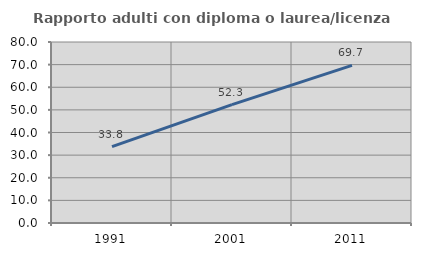
| Category | Rapporto adulti con diploma o laurea/licenza media  |
|---|---|
| 1991.0 | 33.784 |
| 2001.0 | 52.313 |
| 2011.0 | 69.688 |